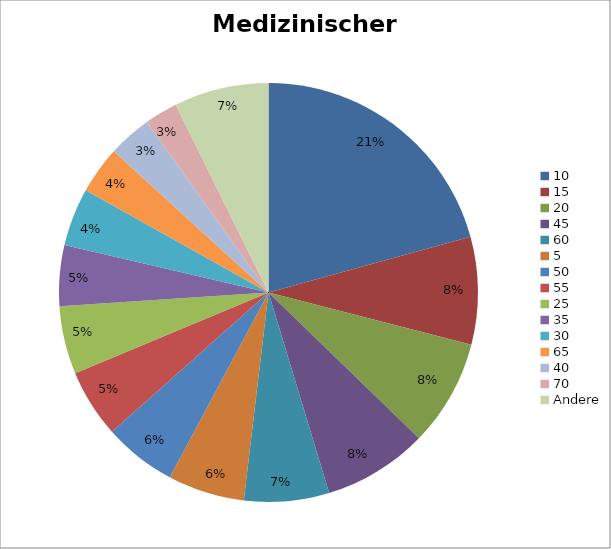
| Category | Series 0 |
|---|---|
| 10 | 3510 |
| 15 | 1404 |
| 20 | 1397 |
| 45 | 1368 |
| 60 | 1111 |
| 5 | 1003 |
| 50 | 954 |
| 55 | 893 |
| 25 | 888 |
| 35 | 794 |
| 30 | 761 |
| 65 | 620 |
| 40 | 568 |
| 70 | 434 |
| Andere | 1237 |